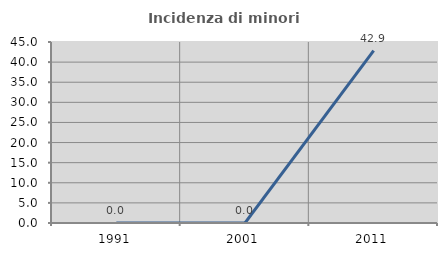
| Category | Incidenza di minori stranieri |
|---|---|
| 1991.0 | 0 |
| 2001.0 | 0 |
| 2011.0 | 42.857 |